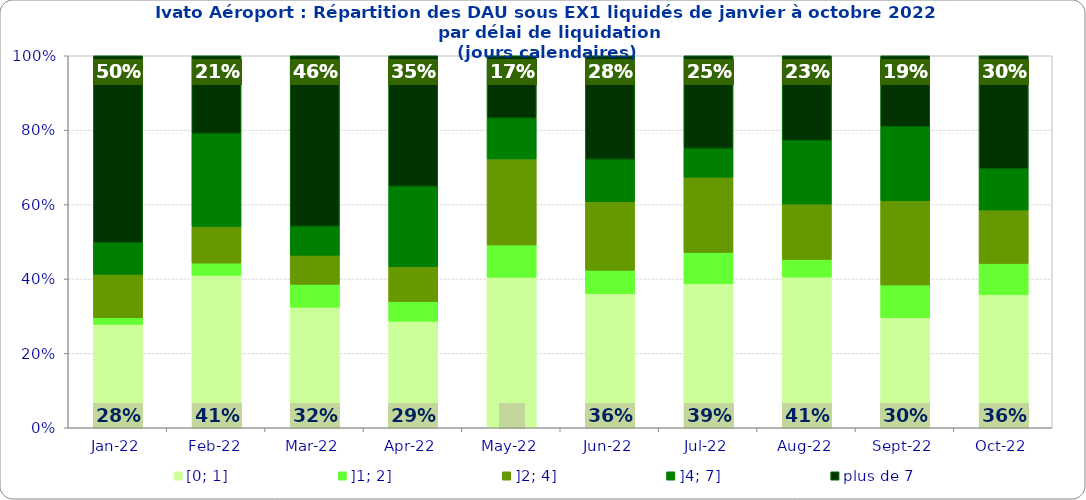
| Category | [0; 1] | ]1; 2] | ]2; 4] | ]4; 7] | plus de 7 |
|---|---|---|---|---|---|
| 2022-01-01 | 0.278 | 0.018 | 0.117 | 0.085 | 0.502 |
| 2022-02-01 | 0.41 | 0.033 | 0.098 | 0.25 | 0.209 |
| 2022-03-01 | 0.324 | 0.061 | 0.078 | 0.078 | 0.458 |
| 2022-04-01 | 0.287 | 0.053 | 0.094 | 0.216 | 0.351 |
| 2022-05-01 | 0.405 | 0.087 | 0.231 | 0.11 | 0.168 |
| 2022-06-01 | 0.361 | 0.063 | 0.184 | 0.114 | 0.278 |
| 2022-07-01 | 0.387 | 0.084 | 0.202 | 0.077 | 0.249 |
| 2022-08-01 | 0.405 | 0.047 | 0.149 | 0.171 | 0.228 |
| 2022-09-01 | 0.296 | 0.088 | 0.227 | 0.199 | 0.19 |
| 2022-10-01 | 0.358 | 0.084 | 0.144 | 0.111 | 0.304 |